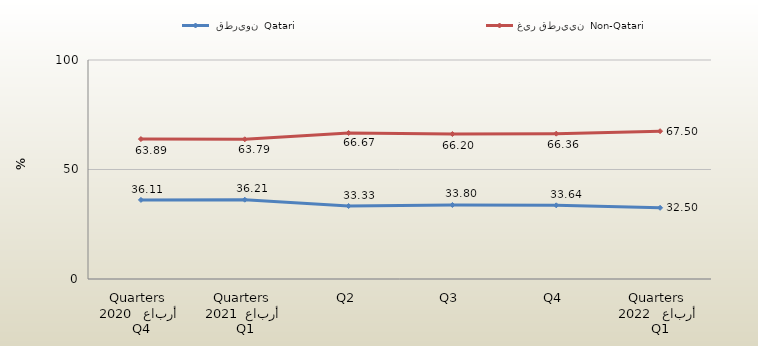
| Category |  قطريون  Qatari | غير قطريين  Non-Qatari |
|---|---|---|
| 0 | 36.111 | 63.889 |
| 1 | 36.207 | 63.793 |
| 2 | 33.333 | 66.667 |
| 3 | 33.8 | 66.2 |
| 4 | 33.641 | 66.359 |
| 5 | 32.5 | 67.5 |